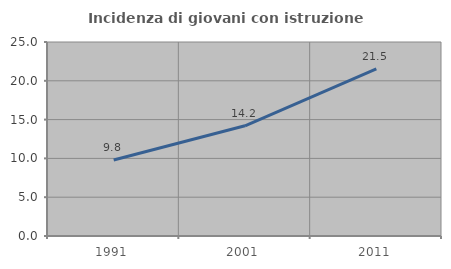
| Category | Incidenza di giovani con istruzione universitaria |
|---|---|
| 1991.0 | 9.792 |
| 2001.0 | 14.198 |
| 2011.0 | 21.548 |